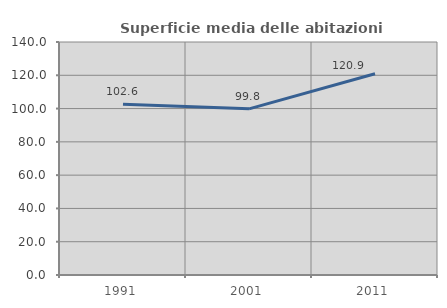
| Category | Superficie media delle abitazioni occupate |
|---|---|
| 1991.0 | 102.613 |
| 2001.0 | 99.85 |
| 2011.0 | 120.887 |